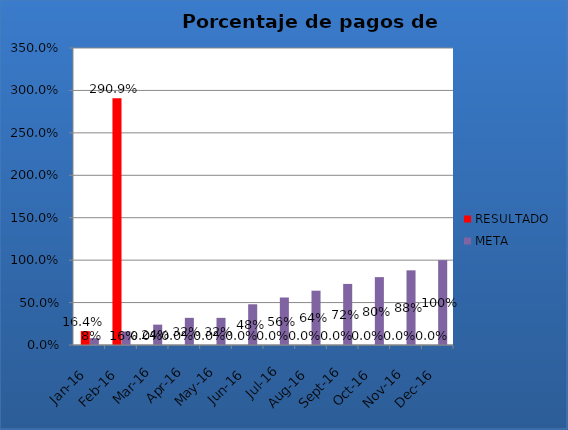
| Category | RESULTADO | META |
|---|---|---|
| ene-16 | 0.164 | 0.08 |
| feb-16 | 2.909 | 0.16 |
| mar-16 | 0 | 0.24 |
| abr-16 | 0 | 0.32 |
| may-16 | 0 | 0.32 |
| jun-16 | 0 | 0.48 |
| jul-16 | 0 | 0.56 |
| ago-16 | 0 | 0.64 |
| sep-16 | 0 | 0.72 |
| oct-16 | 0 | 0.8 |
| nov-16 | 0 | 0.88 |
| dic-16 | 0 | 1 |